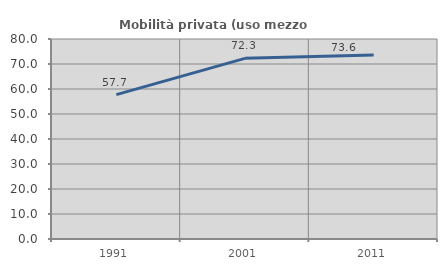
| Category | Mobilità privata (uso mezzo privato) |
|---|---|
| 1991.0 | 57.73 |
| 2001.0 | 72.27 |
| 2011.0 | 73.621 |